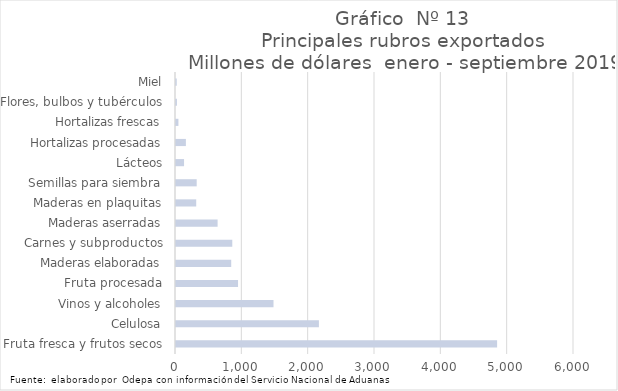
| Category | Series 7 |
|---|---|
| Fruta fresca y frutos secos | 4840664.931 |
| Celulosa | 2154425.472 |
| Vinos y alcoholes | 1469754.761 |
| Fruta procesada | 935057.204 |
| Maderas elaboradas | 832375.231 |
| Carnes y subproductos | 848519.234 |
| Maderas aserradas | 627140.348 |
| Maderas en plaquitas | 304743.715 |
| Semillas para siembra | 311970.271 |
| Lácteos | 121195.883 |
| Hortalizas procesadas | 148955.622 |
| Hortalizas frescas | 36427.196 |
| Flores, bulbos y tubérculos | 13859.486 |
| Miel | 11087.229 |